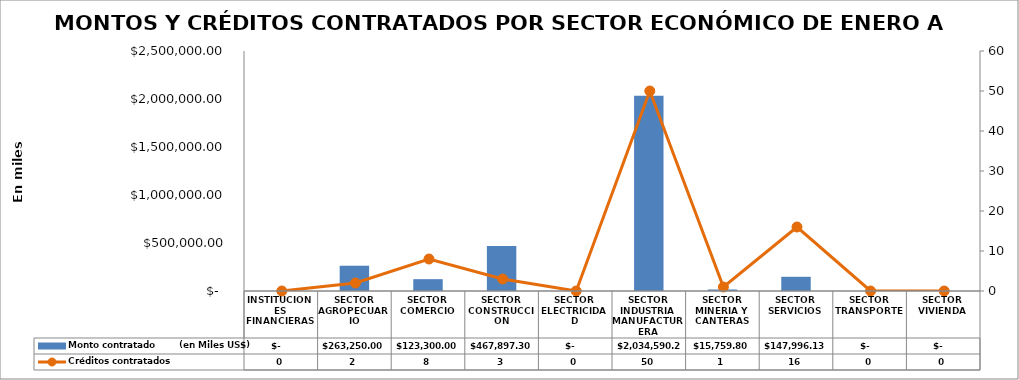
| Category | Monto contratado        (en Miles US$) |
|---|---|
| INSTITUCIONES FINANCIERAS | 0 |
| SECTOR AGROPECUARIO | 263250 |
| SECTOR COMERCIO | 123300 |
| SECTOR CONSTRUCCION | 467897.3 |
| SECTOR ELECTRICIDAD | 0 |
| SECTOR INDUSTRIA MANUFACTURERA | 2034590.22 |
| SECTOR MINERIA Y CANTERAS | 15759.8 |
| SECTOR SERVICIOS | 147996.13 |
| SECTOR TRANSPORTE | 0 |
| SECTOR VIVIENDA | 0 |